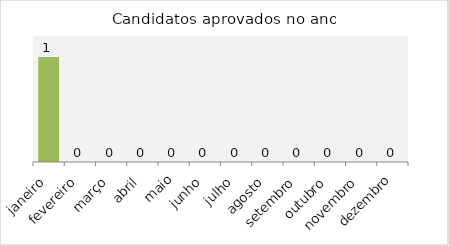
| Category | Candidatos aprovados no ano |
|---|---|
| janeiro | 1 |
| fevereiro | 0 |
| março | 0 |
| abril | 0 |
| maio | 0 |
| junho | 0 |
| julho | 0 |
| agosto | 0 |
| setembro | 0 |
| outubro | 0 |
| novembro | 0 |
| dezembro | 0 |